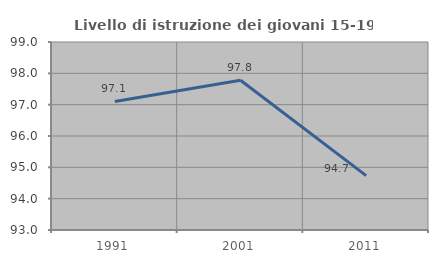
| Category | Livello di istruzione dei giovani 15-19 anni |
|---|---|
| 1991.0 | 97.101 |
| 2001.0 | 97.778 |
| 2011.0 | 94.737 |